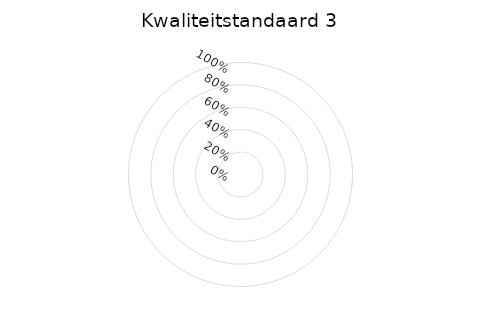
| Category | 3a | 3b | 3c | 3d | 3e |
|---|---|---|---|---|---|
| 0.0 | 0 | 0 | 0 | 0 | 0 |
| 1.0 | 0 | 0 | 0 | 0 | 0 |
| 2.0 | 0 | 0 | 0 | 0 | 0 |
| 3.0 | 0 | 0 | 0 | 0 | 0 |
| 4.0 | 0 | 0 | 0 | 0 | 0 |
| 5.0 | 0 | 0 | 0 | 0 | 0 |
| 6.0 | 0 | 0 | 0 | 0 | 0 |
| 7.0 | 0 | 0 | 0 | 0 | 0 |
| 8.0 | 0 | 0 | 0 | 0 | 0 |
| 9.0 | 0 | 0 | 0 | 0 | 0 |
| 10.0 | 0 | 0 | 0 | 0 | 0 |
| 11.0 | 0 | 0 | 0 | 0 | 0 |
| 12.0 | 0 | 0 | 0 | 0 | 0 |
| 13.0 | 0 | 0 | 0 | 0 | 0 |
| 14.0 | 0 | 0 | 0 | 0 | 0 |
| 15.0 | 0 | 0 | 0 | 0 | 0 |
| 16.0 | 0 | 0 | 0 | 0 | 0 |
| 17.0 | 0 | 0 | 0 | 0 | 0 |
| 18.0 | 0 | 0 | 0 | 0 | 0 |
| 19.0 | 0 | 0 | 0 | 0 | 0 |
| 20.0 | 0 | 0 | 0 | 0 | 0 |
| 21.0 | 0 | 0 | 0 | 0 | 0 |
| 22.0 | 0 | 0 | 0 | 0 | 0 |
| 23.0 | 0 | 0 | 0 | 0 | 0 |
| 24.0 | 0 | 0 | 0 | 0 | 0 |
| 25.0 | 0 | 0 | 0 | 0 | 0 |
| 26.0 | 0 | 0 | 0 | 0 | 0 |
| 27.0 | 0 | 0 | 0 | 0 | 0 |
| 28.0 | 0 | 0 | 0 | 0 | 0 |
| 29.0 | 0 | 0 | 0 | 0 | 0 |
| 30.0 | 0 | 0 | 0 | 0 | 0 |
| 31.0 | 0 | 0 | 0 | 0 | 0 |
| 32.0 | 0 | 0 | 0 | 0 | 0 |
| 33.0 | 0 | 0 | 0 | 0 | 0 |
| 34.0 | 0 | 0 | 0 | 0 | 0 |
| 35.0 | 0 | 0 | 0 | 0 | 0 |
| 36.0 | 0 | 0 | 0 | 0 | 0 |
| 37.0 | 0 | 0 | 0 | 0 | 0 |
| 38.0 | 0 | 0 | 0 | 0 | 0 |
| 39.0 | 0 | 0 | 0 | 0 | 0 |
| 40.0 | 0 | 0 | 0 | 0 | 0 |
| 41.0 | 0 | 0 | 0 | 0 | 0 |
| 42.0 | 0 | 0 | 0 | 0 | 0 |
| 43.0 | 0 | 0 | 0 | 0 | 0 |
| 44.0 | 0 | 0 | 0 | 0 | 0 |
| 45.0 | 0 | 0 | 0 | 0 | 0 |
| 46.0 | 0 | 0 | 0 | 0 | 0 |
| 47.0 | 0 | 0 | 0 | 0 | 0 |
| 48.0 | 0 | 0 | 0 | 0 | 0 |
| 49.0 | 0 | 0 | 0 | 0 | 0 |
| 50.0 | 0 | 0 | 0 | 0 | 0 |
| 51.0 | 0 | 0 | 0 | 0 | 0 |
| 52.0 | 0 | 0 | 0 | 0 | 0 |
| 53.0 | 0 | 0 | 0 | 0 | 0 |
| 54.0 | 0 | 0 | 0 | 0 | 0 |
| 55.0 | 0 | 0 | 0 | 0 | 0 |
| 56.0 | 0 | 0 | 0 | 0 | 0 |
| 57.0 | 0 | 0 | 0 | 0 | 0 |
| 58.0 | 0 | 0 | 0 | 0 | 0 |
| 59.0 | 0 | 0 | 0 | 0 | 0 |
| 60.0 | 0 | 0 | 0 | 0 | 0 |
| 61.0 | 0 | 0 | 0 | 0 | 0 |
| 62.0 | 0 | 0 | 0 | 0 | 0 |
| 63.0 | 0 | 0 | 0 | 0 | 0 |
| 64.0 | 0 | 0 | 0 | 0 | 0 |
| 65.0 | 0 | 0 | 0 | 0 | 0 |
| 66.0 | 0 | 0 | 0 | 0 | 0 |
| 67.0 | 0 | 0 | 0 | 0 | 0 |
| 68.0 | 0 | 0 | 0 | 0 | 0 |
| 69.0 | 0 | 0 | 0 | 0 | 0 |
| 70.0 | 0 | 0 | 0 | 0 | 0 |
| 71.0 | 0 | 0 | 0 | 0 | 0 |
| 72.0 | 0 | 0 | 0 | 0 | 0 |
| 73.0 | 0 | 0 | 0 | 0 | 0 |
| 74.0 | 0 | 0 | 0 | 0 | 0 |
| 75.0 | 0 | 0 | 0 | 0 | 0 |
| 76.0 | 0 | 0 | 0 | 0 | 0 |
| 77.0 | 0 | 0 | 0 | 0 | 0 |
| 78.0 | 0 | 0 | 0 | 0 | 0 |
| 79.0 | 0 | 0 | 0 | 0 | 0 |
| 80.0 | 0 | 0 | 0 | 0 | 0 |
| 81.0 | 0 | 0 | 0 | 0 | 0 |
| 82.0 | 0 | 0 | 0 | 0 | 0 |
| 83.0 | 0 | 0 | 0 | 0 | 0 |
| 84.0 | 0 | 0 | 0 | 0 | 0 |
| 85.0 | 0 | 0 | 0 | 0 | 0 |
| 86.0 | 0 | 0 | 0 | 0 | 0 |
| 87.0 | 0 | 0 | 0 | 0 | 0 |
| 88.0 | 0 | 0 | 0 | 0 | 0 |
| 89.0 | 0 | 0 | 0 | 0 | 0 |
| 90.0 | 0 | 0 | 0 | 0 | 0 |
| 91.0 | 0 | 0 | 0 | 0 | 0 |
| 92.0 | 0 | 0 | 0 | 0 | 0 |
| 93.0 | 0 | 0 | 0 | 0 | 0 |
| 94.0 | 0 | 0 | 0 | 0 | 0 |
| 95.0 | 0 | 0 | 0 | 0 | 0 |
| 96.0 | 0 | 0 | 0 | 0 | 0 |
| 97.0 | 0 | 0 | 0 | 0 | 0 |
| 98.0 | 0 | 0 | 0 | 0 | 0 |
| 99.0 | 0 | 0 | 0 | 0 | 0 |
| 100.0 | 0 | 0 | 0 | 0 | 0 |
| 101.0 | 0 | 0 | 0 | 0 | 0 |
| 102.0 | 0 | 0 | 0 | 0 | 0 |
| 103.0 | 0 | 0 | 0 | 0 | 0 |
| 104.0 | 0 | 0 | 0 | 0 | 0 |
| 105.0 | 0 | 0 | 0 | 0 | 0 |
| 106.0 | 0 | 0 | 0 | 0 | 0 |
| 107.0 | 0 | 0 | 0 | 0 | 0 |
| 108.0 | 0 | 0 | 0 | 0 | 0 |
| 109.0 | 0 | 0 | 0 | 0 | 0 |
| 110.0 | 0 | 0 | 0 | 0 | 0 |
| 111.0 | 0 | 0 | 0 | 0 | 0 |
| 112.0 | 0 | 0 | 0 | 0 | 0 |
| 113.0 | 0 | 0 | 0 | 0 | 0 |
| 114.0 | 0 | 0 | 0 | 0 | 0 |
| 115.0 | 0 | 0 | 0 | 0 | 0 |
| 116.0 | 0 | 0 | 0 | 0 | 0 |
| 117.0 | 0 | 0 | 0 | 0 | 0 |
| 118.0 | 0 | 0 | 0 | 0 | 0 |
| 119.0 | 0 | 0 | 0 | 0 | 0 |
| 120.0 | 0 | 0 | 0 | 0 | 0 |
| 121.0 | 0 | 0 | 0 | 0 | 0 |
| 122.0 | 0 | 0 | 0 | 0 | 0 |
| 123.0 | 0 | 0 | 0 | 0 | 0 |
| 124.0 | 0 | 0 | 0 | 0 | 0 |
| 125.0 | 0 | 0 | 0 | 0 | 0 |
| 126.0 | 0 | 0 | 0 | 0 | 0 |
| 127.0 | 0 | 0 | 0 | 0 | 0 |
| 128.0 | 0 | 0 | 0 | 0 | 0 |
| 129.0 | 0 | 0 | 0 | 0 | 0 |
| 130.0 | 0 | 0 | 0 | 0 | 0 |
| 131.0 | 0 | 0 | 0 | 0 | 0 |
| 132.0 | 0 | 0 | 0 | 0 | 0 |
| 133.0 | 0 | 0 | 0 | 0 | 0 |
| 134.0 | 0 | 0 | 0 | 0 | 0 |
| 135.0 | 0 | 0 | 0 | 0 | 0 |
| 136.0 | 0 | 0 | 0 | 0 | 0 |
| 137.0 | 0 | 0 | 0 | 0 | 0 |
| 138.0 | 0 | 0 | 0 | 0 | 0 |
| 139.0 | 0 | 0 | 0 | 0 | 0 |
| 140.0 | 0 | 0 | 0 | 0 | 0 |
| 141.0 | 0 | 0 | 0 | 0 | 0 |
| 142.0 | 0 | 0 | 0 | 0 | 0 |
| 143.0 | 0 | 0 | 0 | 0 | 0 |
| 144.0 | 0 | 0 | 0 | 0 | 0 |
| 145.0 | 0 | 0 | 0 | 0 | 0 |
| 146.0 | 0 | 0 | 0 | 0 | 0 |
| 147.0 | 0 | 0 | 0 | 0 | 0 |
| 148.0 | 0 | 0 | 0 | 0 | 0 |
| 149.0 | 0 | 0 | 0 | 0 | 0 |
| 150.0 | 0 | 0 | 0 | 0 | 0 |
| 151.0 | 0 | 0 | 0 | 0 | 0 |
| 152.0 | 0 | 0 | 0 | 0 | 0 |
| 153.0 | 0 | 0 | 0 | 0 | 0 |
| 154.0 | 0 | 0 | 0 | 0 | 0 |
| 155.0 | 0 | 0 | 0 | 0 | 0 |
| 156.0 | 0 | 0 | 0 | 0 | 0 |
| 157.0 | 0 | 0 | 0 | 0 | 0 |
| 158.0 | 0 | 0 | 0 | 0 | 0 |
| 159.0 | 0 | 0 | 0 | 0 | 0 |
| 160.0 | 0 | 0 | 0 | 0 | 0 |
| 161.0 | 0 | 0 | 0 | 0 | 0 |
| 162.0 | 0 | 0 | 0 | 0 | 0 |
| 163.0 | 0 | 0 | 0 | 0 | 0 |
| 164.0 | 0 | 0 | 0 | 0 | 0 |
| 165.0 | 0 | 0 | 0 | 0 | 0 |
| 166.0 | 0 | 0 | 0 | 0 | 0 |
| 167.0 | 0 | 0 | 0 | 0 | 0 |
| 168.0 | 0 | 0 | 0 | 0 | 0 |
| 169.0 | 0 | 0 | 0 | 0 | 0 |
| 170.0 | 0 | 0 | 0 | 0 | 0 |
| 171.0 | 0 | 0 | 0 | 0 | 0 |
| 172.0 | 0 | 0 | 0 | 0 | 0 |
| 173.0 | 0 | 0 | 0 | 0 | 0 |
| 174.0 | 0 | 0 | 0 | 0 | 0 |
| 175.0 | 0 | 0 | 0 | 0 | 0 |
| 176.0 | 0 | 0 | 0 | 0 | 0 |
| 177.0 | 0 | 0 | 0 | 0 | 0 |
| 178.0 | 0 | 0 | 0 | 0 | 0 |
| 179.0 | 0 | 0 | 0 | 0 | 0 |
| 180.0 | 0 | 0 | 0 | 0 | 0 |
| 181.0 | 0 | 0 | 0 | 0 | 0 |
| 182.0 | 0 | 0 | 0 | 0 | 0 |
| 183.0 | 0 | 0 | 0 | 0 | 0 |
| 184.0 | 0 | 0 | 0 | 0 | 0 |
| 185.0 | 0 | 0 | 0 | 0 | 0 |
| 186.0 | 0 | 0 | 0 | 0 | 0 |
| 187.0 | 0 | 0 | 0 | 0 | 0 |
| 188.0 | 0 | 0 | 0 | 0 | 0 |
| 189.0 | 0 | 0 | 0 | 0 | 0 |
| 190.0 | 0 | 0 | 0 | 0 | 0 |
| 191.0 | 0 | 0 | 0 | 0 | 0 |
| 192.0 | 0 | 0 | 0 | 0 | 0 |
| 193.0 | 0 | 0 | 0 | 0 | 0 |
| 194.0 | 0 | 0 | 0 | 0 | 0 |
| 195.0 | 0 | 0 | 0 | 0 | 0 |
| 196.0 | 0 | 0 | 0 | 0 | 0 |
| 197.0 | 0 | 0 | 0 | 0 | 0 |
| 198.0 | 0 | 0 | 0 | 0 | 0 |
| 199.0 | 0 | 0 | 0 | 0 | 0 |
| 200.0 | 0 | 0 | 0 | 0 | 0 |
| 201.0 | 0 | 0 | 0 | 0 | 0 |
| 202.0 | 0 | 0 | 0 | 0 | 0 |
| 203.0 | 0 | 0 | 0 | 0 | 0 |
| 204.0 | 0 | 0 | 0 | 0 | 0 |
| 205.0 | 0 | 0 | 0 | 0 | 0 |
| 206.0 | 0 | 0 | 0 | 0 | 0 |
| 207.0 | 0 | 0 | 0 | 0 | 0 |
| 208.0 | 0 | 0 | 0 | 0 | 0 |
| 209.0 | 0 | 0 | 0 | 0 | 0 |
| 210.0 | 0 | 0 | 0 | 0 | 0 |
| 211.0 | 0 | 0 | 0 | 0 | 0 |
| 212.0 | 0 | 0 | 0 | 0 | 0 |
| 213.0 | 0 | 0 | 0 | 0 | 0 |
| 214.0 | 0 | 0 | 0 | 0 | 0 |
| 215.0 | 0 | 0 | 0 | 0 | 0 |
| 216.0 | 0 | 0 | 0 | 0 | 0 |
| 217.0 | 0 | 0 | 0 | 0 | 0 |
| 218.0 | 0 | 0 | 0 | 0 | 0 |
| 219.0 | 0 | 0 | 0 | 0 | 0 |
| 220.0 | 0 | 0 | 0 | 0 | 0 |
| 221.0 | 0 | 0 | 0 | 0 | 0 |
| 222.0 | 0 | 0 | 0 | 0 | 0 |
| 223.0 | 0 | 0 | 0 | 0 | 0 |
| 224.0 | 0 | 0 | 0 | 0 | 0 |
| 225.0 | 0 | 0 | 0 | 0 | 0 |
| 226.0 | 0 | 0 | 0 | 0 | 0 |
| 227.0 | 0 | 0 | 0 | 0 | 0 |
| 228.0 | 0 | 0 | 0 | 0 | 0 |
| 229.0 | 0 | 0 | 0 | 0 | 0 |
| 230.0 | 0 | 0 | 0 | 0 | 0 |
| 231.0 | 0 | 0 | 0 | 0 | 0 |
| 232.0 | 0 | 0 | 0 | 0 | 0 |
| 233.0 | 0 | 0 | 0 | 0 | 0 |
| 234.0 | 0 | 0 | 0 | 0 | 0 |
| 235.0 | 0 | 0 | 0 | 0 | 0 |
| 236.0 | 0 | 0 | 0 | 0 | 0 |
| 237.0 | 0 | 0 | 0 | 0 | 0 |
| 238.0 | 0 | 0 | 0 | 0 | 0 |
| 239.0 | 0 | 0 | 0 | 0 | 0 |
| 240.0 | 0 | 0 | 0 | 0 | 0 |
| 241.0 | 0 | 0 | 0 | 0 | 0 |
| 242.0 | 0 | 0 | 0 | 0 | 0 |
| 243.0 | 0 | 0 | 0 | 0 | 0 |
| 244.0 | 0 | 0 | 0 | 0 | 0 |
| 245.0 | 0 | 0 | 0 | 0 | 0 |
| 246.0 | 0 | 0 | 0 | 0 | 0 |
| 247.0 | 0 | 0 | 0 | 0 | 0 |
| 248.0 | 0 | 0 | 0 | 0 | 0 |
| 249.0 | 0 | 0 | 0 | 0 | 0 |
| 250.0 | 0 | 0 | 0 | 0 | 0 |
| 251.0 | 0 | 0 | 0 | 0 | 0 |
| 252.0 | 0 | 0 | 0 | 0 | 0 |
| 253.0 | 0 | 0 | 0 | 0 | 0 |
| 254.0 | 0 | 0 | 0 | 0 | 0 |
| 255.0 | 0 | 0 | 0 | 0 | 0 |
| 256.0 | 0 | 0 | 0 | 0 | 0 |
| 257.0 | 0 | 0 | 0 | 0 | 0 |
| 258.0 | 0 | 0 | 0 | 0 | 0 |
| 259.0 | 0 | 0 | 0 | 0 | 0 |
| 260.0 | 0 | 0 | 0 | 0 | 0 |
| 261.0 | 0 | 0 | 0 | 0 | 0 |
| 262.0 | 0 | 0 | 0 | 0 | 0 |
| 263.0 | 0 | 0 | 0 | 0 | 0 |
| 264.0 | 0 | 0 | 0 | 0 | 0 |
| 265.0 | 0 | 0 | 0 | 0 | 0 |
| 266.0 | 0 | 0 | 0 | 0 | 0 |
| 267.0 | 0 | 0 | 0 | 0 | 0 |
| 268.0 | 0 | 0 | 0 | 0 | 0 |
| 269.0 | 0 | 0 | 0 | 0 | 0 |
| 270.0 | 0 | 0 | 0 | 0 | 0 |
| 271.0 | 0 | 0 | 0 | 0 | 0 |
| 272.0 | 0 | 0 | 0 | 0 | 0 |
| 273.0 | 0 | 0 | 0 | 0 | 0 |
| 274.0 | 0 | 0 | 0 | 0 | 0 |
| 275.0 | 0 | 0 | 0 | 0 | 0 |
| 276.0 | 0 | 0 | 0 | 0 | 0 |
| 277.0 | 0 | 0 | 0 | 0 | 0 |
| 278.0 | 0 | 0 | 0 | 0 | 0 |
| 279.0 | 0 | 0 | 0 | 0 | 0 |
| 280.0 | 0 | 0 | 0 | 0 | 0 |
| 281.0 | 0 | 0 | 0 | 0 | 0 |
| 282.0 | 0 | 0 | 0 | 0 | 0 |
| 283.0 | 0 | 0 | 0 | 0 | 0 |
| 284.0 | 0 | 0 | 0 | 0 | 0 |
| 285.0 | 0 | 0 | 0 | 0 | 0 |
| 286.0 | 0 | 0 | 0 | 0 | 0 |
| 287.0 | 0 | 0 | 0 | 0 | 0 |
| 288.0 | 0 | 0 | 0 | 0 | 0 |
| 289.0 | 0 | 0 | 0 | 0 | 0 |
| 290.0 | 0 | 0 | 0 | 0 | 0 |
| 291.0 | 0 | 0 | 0 | 0 | 0 |
| 292.0 | 0 | 0 | 0 | 0 | 0 |
| 293.0 | 0 | 0 | 0 | 0 | 0 |
| 294.0 | 0 | 0 | 0 | 0 | 0 |
| 295.0 | 0 | 0 | 0 | 0 | 0 |
| 296.0 | 0 | 0 | 0 | 0 | 0 |
| 297.0 | 0 | 0 | 0 | 0 | 0 |
| 298.0 | 0 | 0 | 0 | 0 | 0 |
| 299.0 | 0 | 0 | 0 | 0 | 0 |
| 300.0 | 0 | 0 | 0 | 0 | 0 |
| 301.0 | 0 | 0 | 0 | 0 | 0 |
| 302.0 | 0 | 0 | 0 | 0 | 0 |
| 303.0 | 0 | 0 | 0 | 0 | 0 |
| 304.0 | 0 | 0 | 0 | 0 | 0 |
| 305.0 | 0 | 0 | 0 | 0 | 0 |
| 306.0 | 0 | 0 | 0 | 0 | 0 |
| 307.0 | 0 | 0 | 0 | 0 | 0 |
| 308.0 | 0 | 0 | 0 | 0 | 0 |
| 309.0 | 0 | 0 | 0 | 0 | 0 |
| 310.0 | 0 | 0 | 0 | 0 | 0 |
| 311.0 | 0 | 0 | 0 | 0 | 0 |
| 312.0 | 0 | 0 | 0 | 0 | 0 |
| 313.0 | 0 | 0 | 0 | 0 | 0 |
| 314.0 | 0 | 0 | 0 | 0 | 0 |
| 315.0 | 0 | 0 | 0 | 0 | 0 |
| 316.0 | 0 | 0 | 0 | 0 | 0 |
| 317.0 | 0 | 0 | 0 | 0 | 0 |
| 318.0 | 0 | 0 | 0 | 0 | 0 |
| 319.0 | 0 | 0 | 0 | 0 | 0 |
| 320.0 | 0 | 0 | 0 | 0 | 0 |
| 321.0 | 0 | 0 | 0 | 0 | 0 |
| 322.0 | 0 | 0 | 0 | 0 | 0 |
| 323.0 | 0 | 0 | 0 | 0 | 0 |
| 324.0 | 0 | 0 | 0 | 0 | 0 |
| 325.0 | 0 | 0 | 0 | 0 | 0 |
| 326.0 | 0 | 0 | 0 | 0 | 0 |
| 327.0 | 0 | 0 | 0 | 0 | 0 |
| 328.0 | 0 | 0 | 0 | 0 | 0 |
| 329.0 | 0 | 0 | 0 | 0 | 0 |
| 330.0 | 0 | 0 | 0 | 0 | 0 |
| 331.0 | 0 | 0 | 0 | 0 | 0 |
| 332.0 | 0 | 0 | 0 | 0 | 0 |
| 333.0 | 0 | 0 | 0 | 0 | 0 |
| 334.0 | 0 | 0 | 0 | 0 | 0 |
| 335.0 | 0 | 0 | 0 | 0 | 0 |
| 336.0 | 0 | 0 | 0 | 0 | 0 |
| 337.0 | 0 | 0 | 0 | 0 | 0 |
| 338.0 | 0 | 0 | 0 | 0 | 0 |
| 339.0 | 0 | 0 | 0 | 0 | 0 |
| 340.0 | 0 | 0 | 0 | 0 | 0 |
| 341.0 | 0 | 0 | 0 | 0 | 0 |
| 342.0 | 0 | 0 | 0 | 0 | 0 |
| 343.0 | 0 | 0 | 0 | 0 | 0 |
| 344.0 | 0 | 0 | 0 | 0 | 0 |
| 345.0 | 0 | 0 | 0 | 0 | 0 |
| 346.0 | 0 | 0 | 0 | 0 | 0 |
| 347.0 | 0 | 0 | 0 | 0 | 0 |
| 348.0 | 0 | 0 | 0 | 0 | 0 |
| 349.0 | 0 | 0 | 0 | 0 | 0 |
| 350.0 | 0 | 0 | 0 | 0 | 0 |
| 351.0 | 0 | 0 | 0 | 0 | 0 |
| 352.0 | 0 | 0 | 0 | 0 | 0 |
| 353.0 | 0 | 0 | 0 | 0 | 0 |
| 354.0 | 0 | 0 | 0 | 0 | 0 |
| 355.0 | 0 | 0 | 0 | 0 | 0 |
| 356.0 | 0 | 0 | 0 | 0 | 0 |
| 357.0 | 0 | 0 | 0 | 0 | 0 |
| 358.0 | 0 | 0 | 0 | 0 | 0 |
| 359.0 | 0 | 0 | 0 | 0 | 0 |
| 360.0 | 0 | 0 | 0 | 0 | 0 |